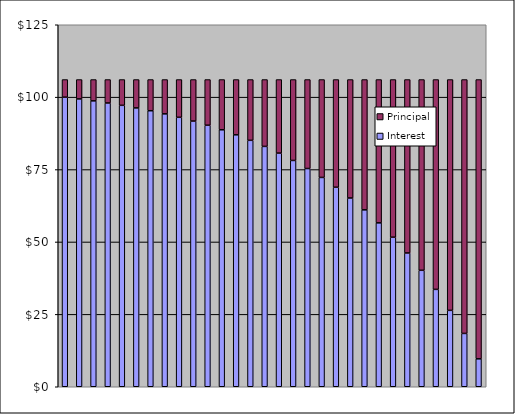
| Category | Interest | Principal |
|---|---|---|
| 0 | 100 | 6.079 |
| 1 | 99.392 | 6.687 |
| 2 | 98.723 | 7.356 |
| 3 | 97.988 | 8.091 |
| 4 | 97.179 | 8.901 |
| 5 | 96.289 | 9.791 |
| 6 | 95.309 | 10.77 |
| 7 | 94.233 | 11.847 |
| 8 | 93.048 | 13.031 |
| 9 | 91.745 | 14.335 |
| 10 | 90.311 | 15.768 |
| 11 | 88.734 | 17.345 |
| 12 | 87 | 19.079 |
| 13 | 85.092 | 20.987 |
| 14 | 82.993 | 23.086 |
| 15 | 80.685 | 25.395 |
| 16 | 78.145 | 27.934 |
| 17 | 75.352 | 30.727 |
| 18 | 72.279 | 33.8 |
| 19 | 68.899 | 37.18 |
| 20 | 65.181 | 40.898 |
| 21 | 61.091 | 44.988 |
| 22 | 56.592 | 49.487 |
| 23 | 51.644 | 54.435 |
| 24 | 46.2 | 59.879 |
| 25 | 40.212 | 65.867 |
| 26 | 33.626 | 72.454 |
| 27 | 26.38 | 79.699 |
| 28 | 18.41 | 87.669 |
| 29 | 9.644 | 96.436 |